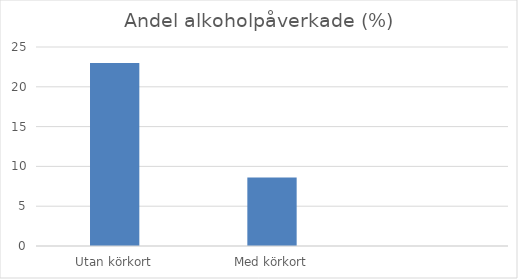
| Category | Andel % |
|---|---|
| Utan körkort | 23 |
| Med körkort | 8.6 |